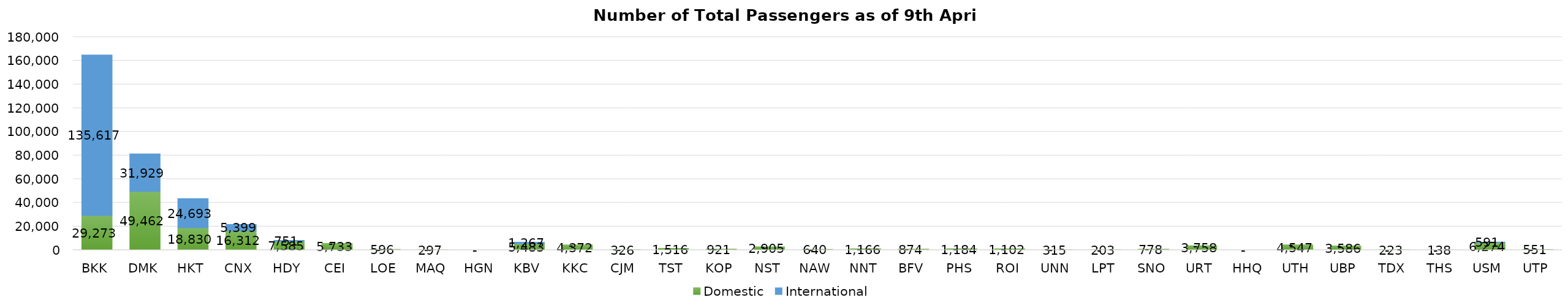
| Category | Domestic | International |
|---|---|---|
| BKK | 29273 | 135617 |
| DMK | 49462 | 31929 |
| HKT | 18830 | 24693 |
| CNX | 16312 | 5399 |
| HDY | 7585 | 751 |
| CEI | 5733 | 0 |
| LOE | 596 | 0 |
| MAQ | 297 | 0 |
| HGN | 0 | 0 |
| KBV | 5483 | 1267 |
| KKC | 4372 | 0 |
| CJM | 326 | 0 |
| TST | 1516 | 0 |
| KOP | 921 | 0 |
| NST | 2905 | 0 |
| NAW | 640 | 0 |
| NNT | 1166 | 0 |
| BFV | 874 | 0 |
| PHS | 1184 | 0 |
| ROI | 1102 | 0 |
| UNN | 315 | 0 |
| LPT | 203 | 0 |
| SNO | 778 | 0 |
| URT | 3758 | 0 |
| HHQ | 0 | 0 |
| UTH | 4547 | 0 |
| UBP | 3586 | 0 |
| TDX | 223 | 0 |
| THS | 138 | 0 |
| USM | 6274 | 591 |
| UTP | 551 | 0 |